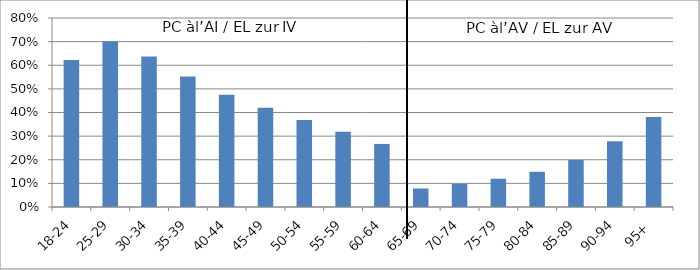
| Category | PC à l’AI / EL zur IV PC à l’AV / EL zur AV |
|---|---|
| 18-24 | 0.622 |
| 25-29 | 0.7 |
| 30-34 | 0.637 |
| 35-39 | 0.553 |
| 40-44 | 0.475 |
| 45-49 | 0.42 |
| 50-54 | 0.369 |
| 55-59 | 0.319 |
| 60-64 | 0.267 |
| 65-69 | 0.078 |
| 70-74 | 0.098 |
| 75-79 | 0.12 |
| 80-84 | 0.149 |
| 85-89 | 0.199 |
| 90-94 | 0.278 |
| 95+ | 0.381 |